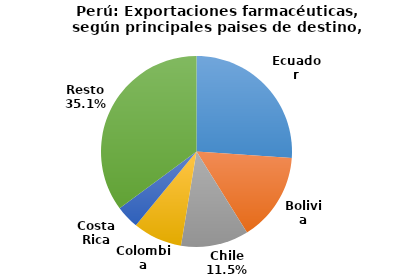
| Category | Series 0 |
|---|---|
| Ecuador | 26.105 |
| Bolivia | 15.032 |
| Chile | 11.469 |
| Colombia | 8.339 |
| Costa Rica | 3.94 |
| Resto | 35.114 |